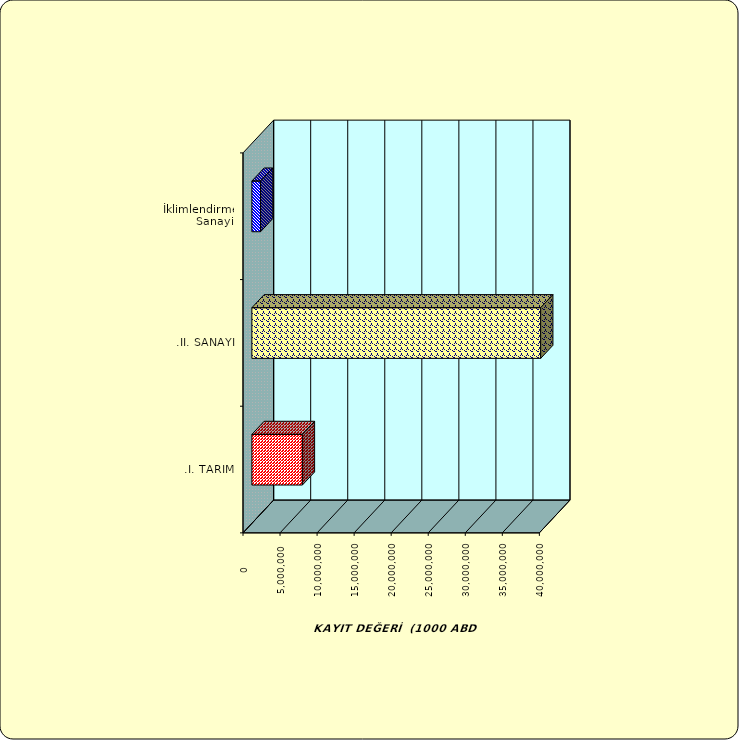
| Category | Series 0 |
|---|---|
| .I. TARIM | 6814446.618 |
| .II. SANAYİ | 38981514.542 |
|  İklimlendirme Sanayii | 1172206.117 |